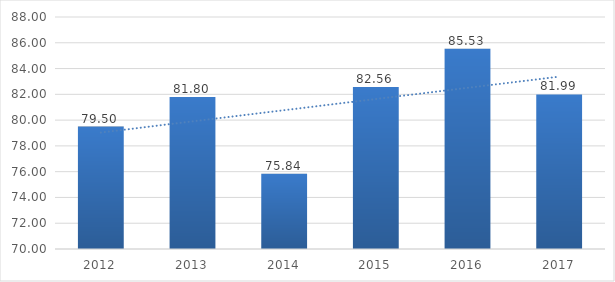
| Category | Series 0 |
|---|---|
| 2012.0 | 79.5 |
| 2013.0 | 81.8 |
| 2014.0 | 75.84 |
| 2015.0 | 82.56 |
| 2016.0 | 85.53 |
| 2017.0 | 81.99 |